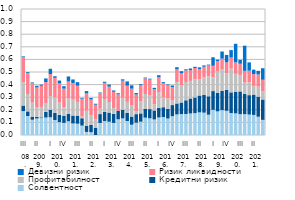
| Category | Солвентност | Кредитни ризик | Профитабилност | Ризик ликвидности | Девизни ризик |
|---|---|---|---|---|---|
| 0 | 0.19 | 0.044 | 0.186 | 0.2 | 0.005 |
| 1 | 0.151 | 0.036 | 0.138 | 0.168 | 0.006 |
| 2 | 0.121 | 0.022 | 0.114 | 0.156 | 0.005 |
| 3 | 0.131 | 0.014 | 0.075 | 0.158 | 0.014 |
| 4 | 0.135 | 0.005 | 0.083 | 0.168 | 0.009 |
| 5 | 0.139 | 0.045 | 0.066 | 0.17 | 0.029 |
| 6 | 0.141 | 0.058 | 0.107 | 0.178 | 0.041 |
| 7 | 0.118 | 0.057 | 0.124 | 0.154 | 0.013 |
| 8 | 0.102 | 0.058 | 0.098 | 0.151 | 0.023 |
| 9 | 0.096 | 0.055 | 0.071 | 0.146 | 0.019 |
| 10 | 0.109 | 0.06 | 0.12 | 0.136 | 0.039 |
| 11 | 0.092 | 0.063 | 0.126 | 0.132 | 0.028 |
| 12 | 0.089 | 0.064 | 0.109 | 0.128 | 0.028 |
| 13 | 0.075 | 0.058 | 0.012 | 0.143 | 0.006 |
| 14 | 0.024 | 0.05 | 0.118 | 0.138 | 0.018 |
| 15 | 0.022 | 0.06 | 0.076 | 0.124 | 0.012 |
| 16 | 0 | 0.058 | 0.066 | 0.117 | 0.008 |
| 17 | 0.096 | 0.07 | 0.043 | 0.123 | 0.006 |
| 18 | 0.111 | 0.074 | 0.101 | 0.128 | 0.009 |
| 19 | 0.105 | 0.073 | 0.084 | 0.122 | 0.016 |
| 20 | 0.096 | 0.072 | 0.047 | 0.129 | 0.01 |
| 21 | 0.125 | 0.067 | 0 | 0.131 | 0.009 |
| 22 | 0.132 | 0.067 | 0.096 | 0.135 | 0.011 |
| 23 | 0.111 | 0.064 | 0.088 | 0.128 | 0.034 |
| 24 | 0.082 | 0.065 | 0.088 | 0.133 | 0.027 |
| 25 | 0.098 | 0.068 | 0.021 | 0.135 | 0.012 |
| 26 | 0.106 | 0.066 | 0.094 | 0.13 | 0.008 |
| 27 | 0.138 | 0.069 | 0.119 | 0.124 | 0.006 |
| 28 | 0.133 | 0.073 | 0.108 | 0.127 | 0.007 |
| 29 | 0.123 | 0.071 | 0.049 | 0.12 | 0.011 |
| 30 | 0.139 | 0.077 | 0.124 | 0.118 | 0.016 |
| 31 | 0.143 | 0.078 | 0.081 | 0.108 | 0.01 |
| 32 | 0.131 | 0.078 | 0.082 | 0.103 | 0.007 |
| 33 | 0.149 | 0.088 | 0.035 | 0.107 | 0.013 |
| 34 | 0.163 | 0.087 | 0.17 | 0.101 | 0.017 |
| 35 | 0.166 | 0.092 | 0.138 | 0.094 | 0.017 |
| 36 | 0.167 | 0.109 | 0.145 | 0.092 | 0.009 |
| 37 | 0.171 | 0.119 | 0.139 | 0.086 | 0.013 |
| 38 | 0.174 | 0.124 | 0.144 | 0.091 | 0.01 |
| 39 | 0.179 | 0.134 | 0.131 | 0.079 | 0.013 |
| 40 | 0.177 | 0.143 | 0.138 | 0.084 | 0.01 |
| 41 | 0.161 | 0.146 | 0.158 | 0.087 | 0.006 |
| 42 | 0.2 | 0.149 | 0.109 | 0.092 | 0.067 |
| 43 | 0.188 | 0.147 | 0.172 | 0.079 | 0.012 |
| 44 | 0.197 | 0.152 | 0.169 | 0.087 | 0.057 |
| 45 | 0.192 | 0.166 | 0.132 | 0.088 | 0.058 |
| 46 | 0.174 | 0.164 | 0.189 | 0.087 | 0.06 |
| 47 | 0.172 | 0.172 | 0.141 | 0.091 | 0.147 |
| 48 | 0.165 | 0.181 | 0.129 | 0.09 | 0.031 |
| 49 | 0.166 | 0.161 | 0.09 | 0.093 | 0.2 |
| 50 | 0.162 | 0.154 | 0.101 | 0.093 | 0.066 |
| 51 | 0.159 | 0.161 | 0.069 | 0.094 | 0.036 |
| 52 | 0.145 | 0.16 | 0.079 | 0.097 | 0.029 |
| 53 | 0.12 | 0.162 | 0.065 | 0.091 | 0.092 |